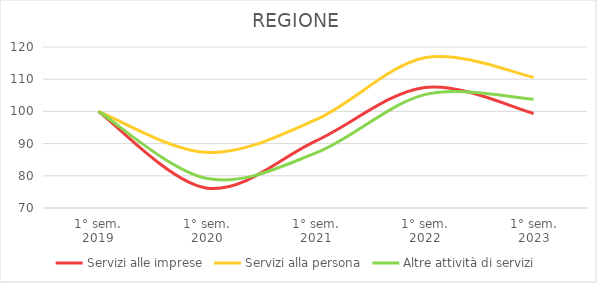
| Category | Servizi alle imprese | Servizi alla persona | Altre attività di servizi |
|---|---|---|---|
| 1° sem.
2019 | 100 | 100 | 100 |
| 1° sem.
2020 | 76.167 | 87.245 | 79.155 |
| 1° sem.
2021 | 90.838 | 97.459 | 87.091 |
| 1° sem.
2022 | 107.434 | 116.675 | 105.214 |
| 1° sem.
2023 | 99.368 | 110.595 | 103.762 |